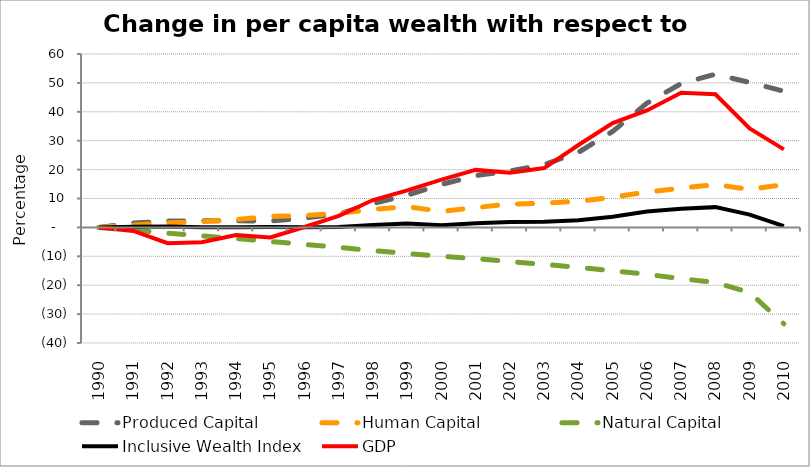
| Category | Produced Capital  | Human Capital | Natural Capital | Inclusive Wealth Index | GDP |
|---|---|---|---|---|---|
| 1990.0 | 0 | 0 | 0 | 0 | 0 |
| 1991.0 | 1.484 | 0.818 | -0.997 | 0.194 | -1.218 |
| 1992.0 | 2.198 | 1.61 | -1.958 | 0.277 | -5.477 |
| 1993.0 | 2.282 | 1.974 | -2.945 | 0.061 | -5.15 |
| 1994.0 | 2.305 | 2.701 | -3.87 | 0.026 | -2.663 |
| 1995.0 | 2.185 | 3.787 | -4.844 | 0.112 | -3.486 |
| 1996.0 | 3.223 | 4.136 | -5.873 | 0.014 | 0.144 |
| 1997.0 | 4.689 | 4.913 | -6.909 | 0.172 | 4.018 |
| 1998.0 | 8.247 | 6.243 | -8.04 | 0.854 | 9.476 |
| 1999.0 | 11.186 | 7.225 | -9.06 | 1.33 | 12.814 |
| 2000.0 | 14.875 | 5.471 | -9.968 | 0.724 | 16.516 |
| 2001.0 | 17.919 | 6.854 | -10.85 | 1.453 | 19.899 |
| 2002.0 | 19.529 | 8.065 | -11.811 | 1.858 | 18.897 |
| 2003.0 | 21.751 | 8.392 | -12.799 | 1.943 | 20.526 |
| 2004.0 | 25.968 | 9.046 | -13.82 | 2.461 | 28.515 |
| 2005.0 | 33.205 | 10.453 | -14.997 | 3.707 | 36.071 |
| 2006.0 | 42.985 | 12.242 | -16.246 | 5.476 | 40.459 |
| 2007.0 | 49.777 | 13.557 | -17.756 | 6.482 | 46.571 |
| 2008.0 | 53.011 | 14.821 | -19.065 | 7.015 | 46.069 |
| 2009.0 | 50.166 | 13.114 | -22.524 | 4.441 | 34.216 |
| 2010.0 | 47.121 | 14.856 | -33.389 | 0.45 | 26.999 |